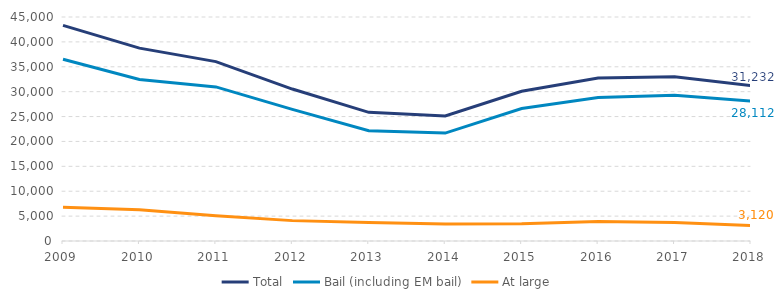
| Category | Total | Bail (including EM bail) | At large |
|---|---|---|---|
| 2009.0 | 43315 | 36527 | 6788 |
| 2010.0 | 38744 | 32459 | 6285 |
| 2011.0 | 36041 | 30952 | 5089 |
| 2012.0 | 30527 | 26434 | 4093 |
| 2013.0 | 25850 | 22156 | 3694 |
| 2014.0 | 25109 | 21684 | 3425 |
| 2015.0 | 30085 | 26620 | 3465 |
| 2016.0 | 32734 | 28814 | 3920 |
| 2017.0 | 33014 | 29288 | 3726 |
| 2018.0 | 31232 | 28112 | 3120 |